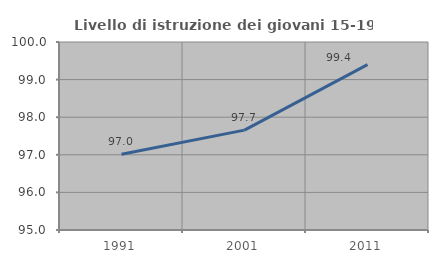
| Category | Livello di istruzione dei giovani 15-19 anni |
|---|---|
| 1991.0 | 97.015 |
| 2001.0 | 97.656 |
| 2011.0 | 99.398 |